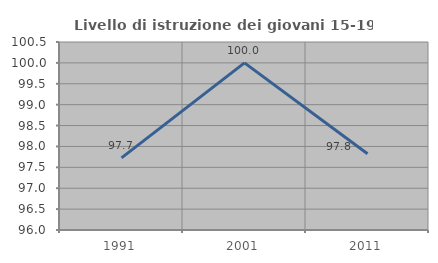
| Category | Livello di istruzione dei giovani 15-19 anni |
|---|---|
| 1991.0 | 97.727 |
| 2001.0 | 100 |
| 2011.0 | 97.826 |